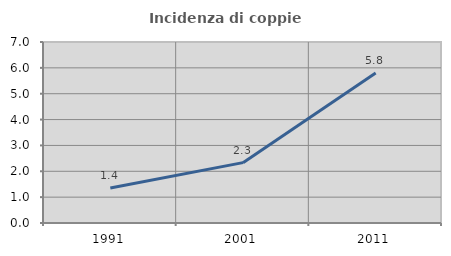
| Category | Incidenza di coppie miste |
|---|---|
| 1991.0 | 1.351 |
| 2001.0 | 2.335 |
| 2011.0 | 5.797 |